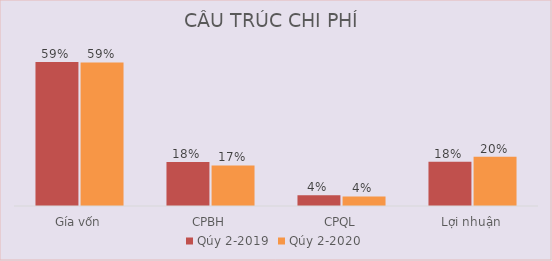
| Category | Qúy 2-2019 | Qúy 2-2020 |
|---|---|---|
| Gía vốn | 0.593 | 0.591 |
| CPBH | 0.182 | 0.167 |
| CPQL | 0.044 | 0.039 |
| Lợi nhuận | 0.182 | 0.203 |